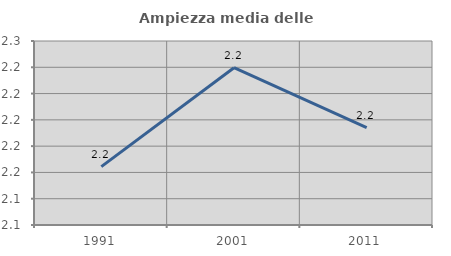
| Category | Ampiezza media delle famiglie |
|---|---|
| 1991.0 | 2.164 |
| 2001.0 | 2.24 |
| 2011.0 | 2.194 |